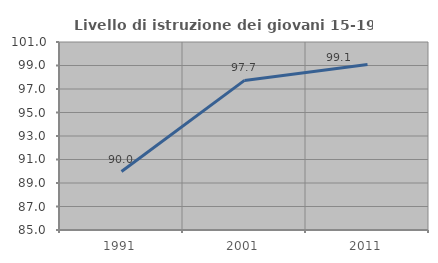
| Category | Livello di istruzione dei giovani 15-19 anni |
|---|---|
| 1991.0 | 89.976 |
| 2001.0 | 97.733 |
| 2011.0 | 99.081 |